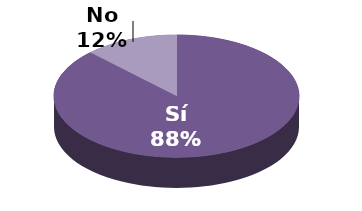
| Category | Series 1 |
|---|---|
| Sí | 106 |
| No | 15 |